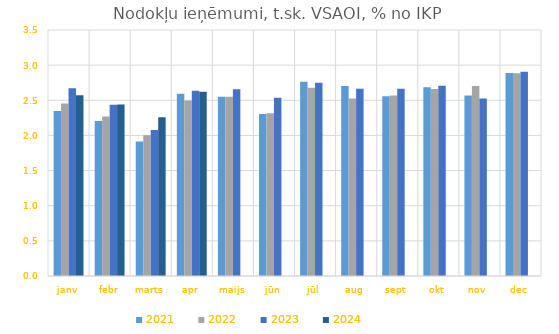
| Category | 2021 | 2022 | 2023 | 2024 |
|---|---|---|---|---|
| janv | 2.348 | 2.453 | 2.67 | 2.572 |
| febr | 2.204 | 2.269 | 2.438 | 2.438 |
| marts | 1.913 | 2.003 | 2.078 | 2.258 |
| apr | 2.592 | 2.495 | 2.637 | 2.621 |
| maijs | 2.55 | 2.55 | 2.656 | 0 |
| jūn | 2.305 | 2.316 | 2.536 | 0 |
| jūl | 2.765 | 2.677 | 2.748 | 0 |
| aug | 2.704 | 2.527 | 2.664 | 0 |
| sept | 2.557 | 2.567 | 2.664 | 0 |
| okt | 2.686 | 2.662 | 2.707 | 0 |
| nov | 2.568 | 2.705 | 2.526 | 0 |
| dec | 2.887 | 2.885 | 2.906 | 0 |